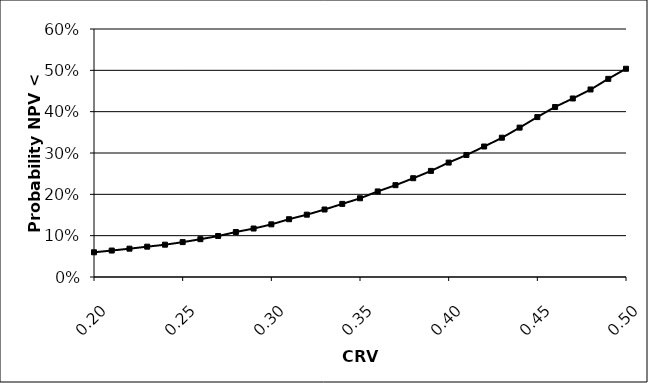
| Category | Series 1 |
|---|---|
| 0.2 | 0.06 |
| 0.21 | 0.064 |
| 0.22 | 0.068 |
| 0.23 | 0.073 |
| 0.24 | 0.078 |
| 0.25 | 0.084 |
| 0.26 | 0.092 |
| 0.27 | 0.099 |
| 0.28 | 0.109 |
| 0.29 | 0.117 |
| 0.3 | 0.127 |
| 0.31 | 0.14 |
| 0.32 | 0.151 |
| 0.33 | 0.163 |
| 0.34 | 0.177 |
| 0.35 | 0.19 |
| 0.36 | 0.207 |
| 0.37 | 0.222 |
| 0.38 | 0.239 |
| 0.39 | 0.257 |
| 0.4 | 0.277 |
| 0.41 | 0.295 |
| 0.42 | 0.316 |
| 0.43 | 0.337 |
| 0.44 | 0.361 |
| 0.45 | 0.387 |
| 0.46 | 0.411 |
| 0.47 | 0.432 |
| 0.48 | 0.454 |
| 0.49 | 0.479 |
| 0.5 | 0.504 |